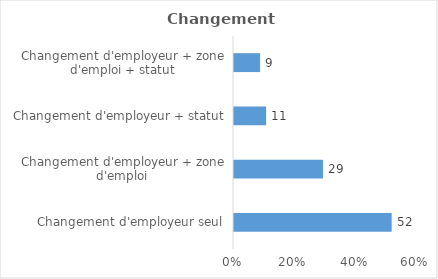
| Category | Series 0 |
|---|---|
| Changement d'employeur seul | 51.698 |
| Changement d'employeur + zone d'emploi | 29.21 |
| Changement d'employeur + statut | 10.531 |
| Changement d'employeur + zone d'emploi + statut | 8.562 |